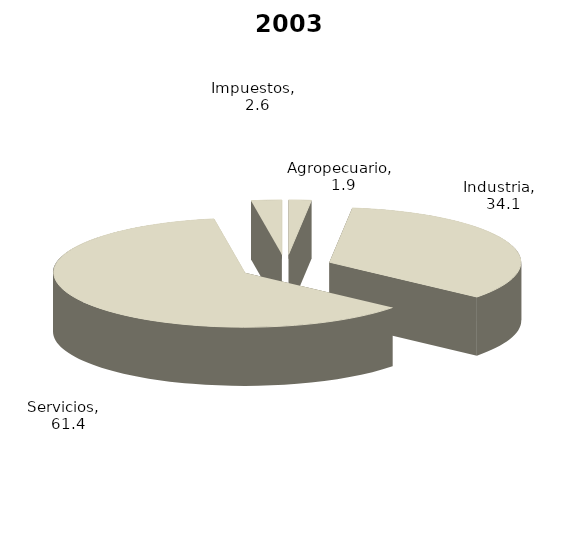
| Category | 2003 |
|---|---|
| Agropecuario | 1.902 |
| Industria | 34.138 |
| Servicios | 61.389 |
| Impuestos | 2.571 |